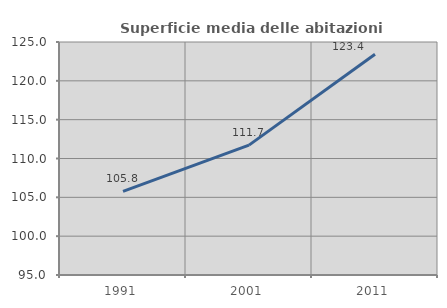
| Category | Superficie media delle abitazioni occupate |
|---|---|
| 1991.0 | 105.764 |
| 2001.0 | 111.722 |
| 2011.0 | 123.424 |